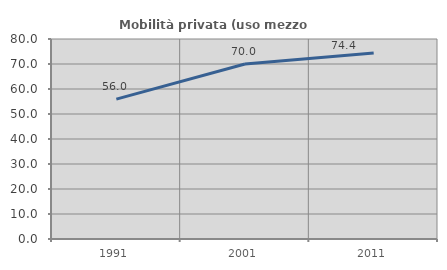
| Category | Mobilità privata (uso mezzo privato) |
|---|---|
| 1991.0 | 55.951 |
| 2001.0 | 70 |
| 2011.0 | 74.441 |